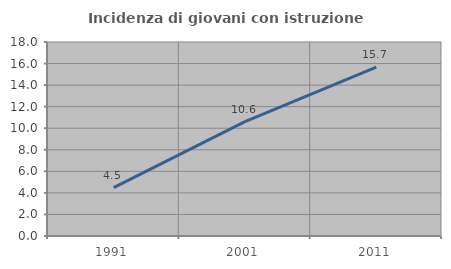
| Category | Incidenza di giovani con istruzione universitaria |
|---|---|
| 1991.0 | 4.494 |
| 2001.0 | 10.619 |
| 2011.0 | 15.663 |